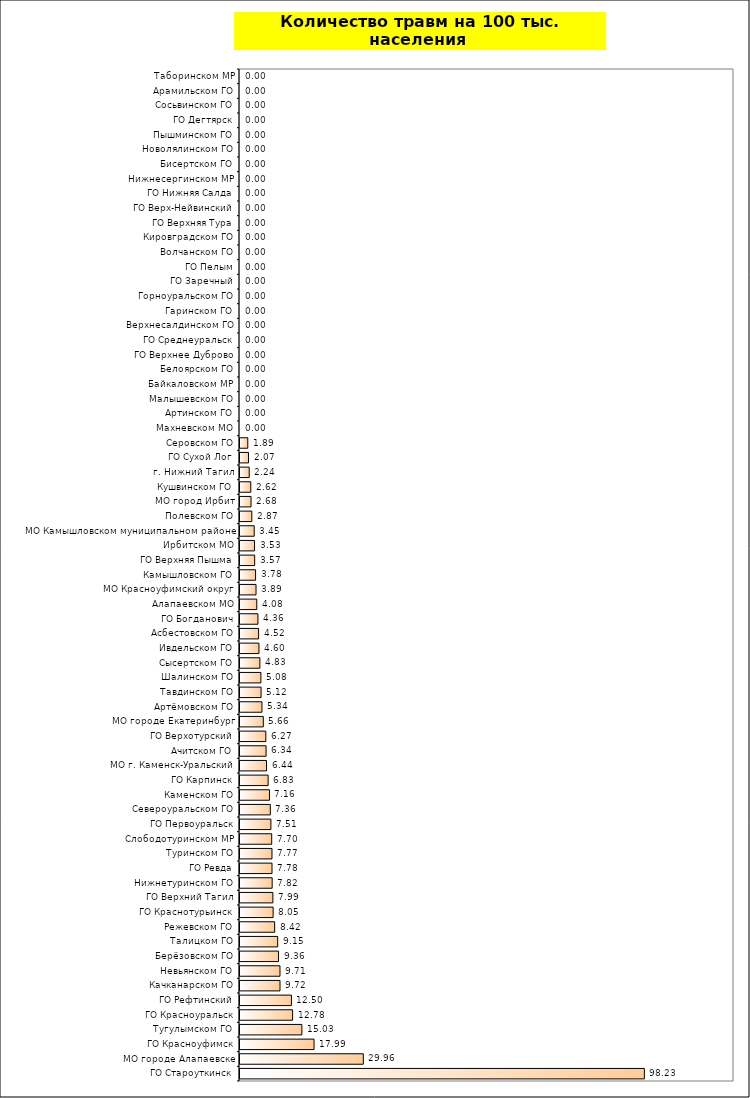
| Category | Series 0 |
|---|---|
| ГО Староуткинск | 98.232 |
| МО городе Алапаевске | 29.956 |
| ГО Красноуфимск | 17.988 |
| Тугулымском ГО | 15.029 |
| ГО Красноуральск | 12.78 |
| ГО Рефтинский | 12.496 |
| Качканарском ГО | 9.718 |
| Невьянском ГО | 9.714 |
| Берёзовском ГО | 9.36 |
| Талицком ГО | 9.154 |
| Режевском ГО | 8.419 |
| ГО Краснотурьинск | 8.049 |
| ГО Верхний Тагил | 7.988 |
| Нижнетуринском ГО | 7.818 |
| ГО Ревда | 7.775 |
| Туринском ГО | 7.768 |
| Слободотуринском МР | 7.705 |
| ГО Первоуральск | 7.507 |
| Североуральском ГО | 7.364 |
| Каменском ГО | 7.164 |
| ГО Карпинск | 6.832 |
| МО г. Каменск-Уральский | 6.439 |
| Ачитском ГО | 6.337 |
| ГО Верхотурский | 6.272 |
| МО городе Екатеринбург | 5.661 |
| Артёмовском ГО | 5.335 |
| Тавдинском ГО | 5.124 |
| Шалинском ГО | 5.078 |
| Сысертском ГО | 4.829 |
| Ивдельском ГО | 4.602 |
| Асбестовском ГО | 4.518 |
| ГО Богданович | 4.36 |
| Алапаевском МО | 4.075 |
| МО Красноуфимский округ | 3.893 |
| Камышловском ГО | 3.783 |
| ГО Верхняя Пышма | 3.567 |
| Ирбитском МО | 3.529 |
| МО Камышловском муниципальном районе | 3.453 |
| Полевском ГО | 2.87 |
| МО город Ирбит | 2.681 |
| Кушвинском ГО | 2.622 |
| г. Нижний Тагил | 2.242 |
| ГО Сухой Лог | 2.068 |
| Серовском ГО | 1.893 |
| Махневском МО | 0 |
| Артинском ГО | 0 |
| Малышевском ГО | 0 |
| Байкаловском МР | 0 |
| Белоярском ГО | 0 |
| ГО Верхнее Дуброво | 0 |
| ГО Среднеуральск | 0 |
| Верхнесалдинском ГО | 0 |
| Гаринском ГО | 0 |
| Горноуральском ГО | 0 |
| ГО Заречный | 0 |
| ГО Пелым | 0 |
| Волчанском ГО | 0 |
| Кировградском ГО | 0 |
| ГО Верхняя Тура | 0 |
| ГО Верх-Нейвинский | 0 |
| ГО Нижняя Салда | 0 |
| Нижнесергинском МР | 0 |
| Бисертском ГО | 0 |
| Новолялинском ГО | 0 |
| Пышминском ГО | 0 |
| ГО Дегтярск | 0 |
| Сосьвинском ГО | 0 |
| Арамильском ГО | 0 |
| Таборинском МР | 0 |